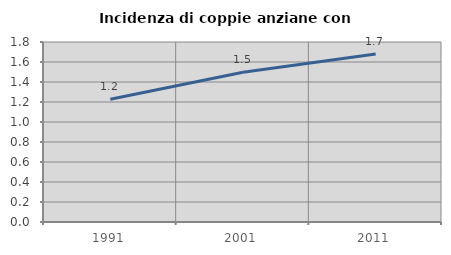
| Category | Incidenza di coppie anziane con figli |
|---|---|
| 1991.0 | 1.227 |
| 2001.0 | 1.497 |
| 2011.0 | 1.681 |